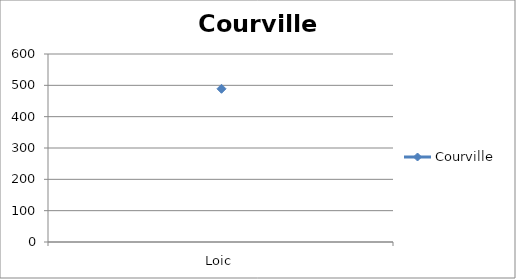
| Category | Courville |
|---|---|
| Loic | 489 |